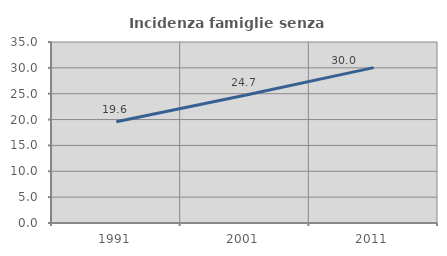
| Category | Incidenza famiglie senza nuclei |
|---|---|
| 1991.0 | 19.595 |
| 2001.0 | 24.716 |
| 2011.0 | 30.049 |